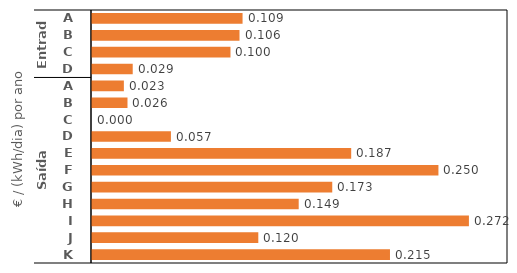
| Category | Preços pré-equalização |
|---|---|
| 0 | 0.109 |
| 1 | 0.106 |
| 2 | 0.1 |
| 3 | 0.029 |
| 4 | 0.023 |
| 5 | 0.026 |
| 6 | 0 |
| 7 | 0.057 |
| 8 | 0.187 |
| 9 | 0.25 |
| 10 | 0.173 |
| 11 | 0.149 |
| 12 | 0.272 |
| 13 | 0.12 |
| 14 | 0.215 |